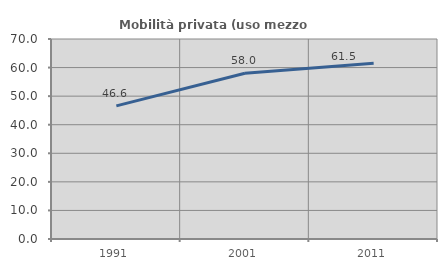
| Category | Mobilità privata (uso mezzo privato) |
|---|---|
| 1991.0 | 46.592 |
| 2001.0 | 58.029 |
| 2011.0 | 61.515 |